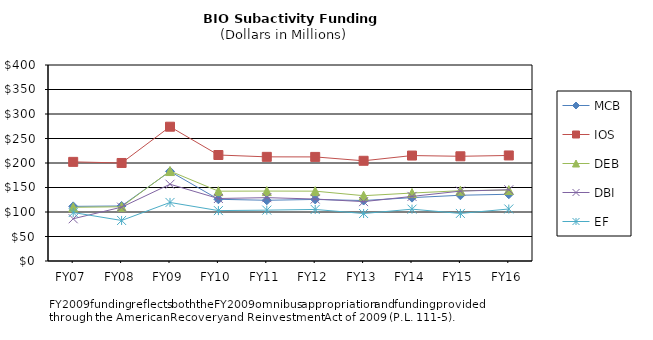
| Category | MCB | IOS | DEB | DBI | EF |
|---|---|---|---|---|---|
| FY07 | 111.5 | 202.31 | 109.6 | 86.21 | 98.92 |
| FY08 | 112.28 | 200.04 | 110.71 | 109.86 | 82.73 |
| FY09 | 182.81 | 274.05 | 183.6 | 156.69 | 119.48 |
| FY10 | 125.9 | 216.32 | 142.5 | 127.54 | 102.85 |
| FY11 | 123.93 | 212.56 | 142.72 | 129.28 | 103.79 |
| FY12 | 125.63 | 212.43 | 142.55 | 126.46 | 105.22 |
| FY13 | 123.4 | 204.5 | 133.26 | 121.16 | 96.89 |
| FY14 | 129.322 | 215.207 | 138.705 | 131.811 | 105.792 |
| FY15 | 134.163 | 213.711 | 143.491 | 142.604 | 97.06 |
| FY16 | 136.21 | 215.4 | 144.76 | 145.41 | 106.14 |